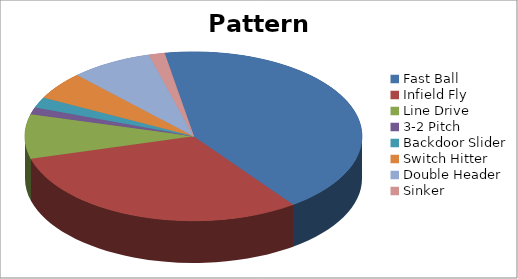
| Category | Pattern Distribution |
|---|---|
| Fast Ball | 403 |
| Infield Fly | 290 |
| Line Drive | 80 |
| 3-2 Pitch | 13 |
| Backdoor Slider | 19 |
| Switch Hitter | 50 |
| Double Header | 74 |
| Sinker | 14 |